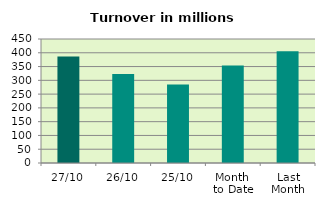
| Category | Series 0 |
|---|---|
| 27/10 | 386.138 |
| 26/10 | 323.432 |
| 25/10 | 284.929 |
| Month 
to Date | 354.13 |
| Last
Month | 405.806 |